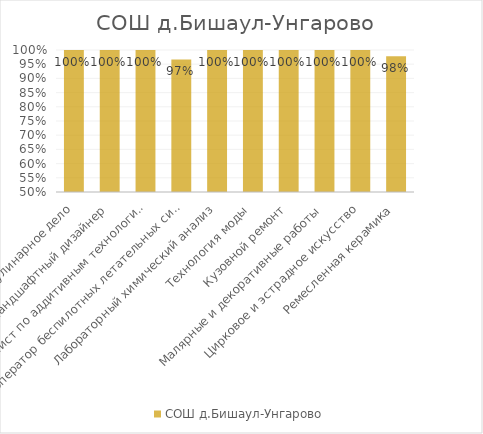
| Category | СОШ д.Бишаул-Унгарово |
|---|---|
| Кулинарное дело | 1 |
| Ландшафтный дизайнер | 1 |
| Специалист по аддитивным технологиям | 1 |
| Оператор беспилотных летательных систем | 0.967 |
| Лабораторный химический анализ | 1 |
| Технология моды | 1 |
| Кузовной ремонт | 1 |
| Малярные и декоративные работы | 1 |
| Цирковое и эстрадное искусство | 1 |
| Ремесленная керамика | 0.978 |